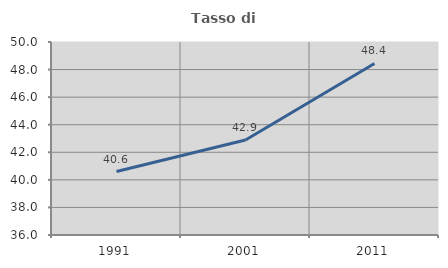
| Category | Tasso di occupazione   |
|---|---|
| 1991.0 | 40.601 |
| 2001.0 | 42.887 |
| 2011.0 | 48.445 |